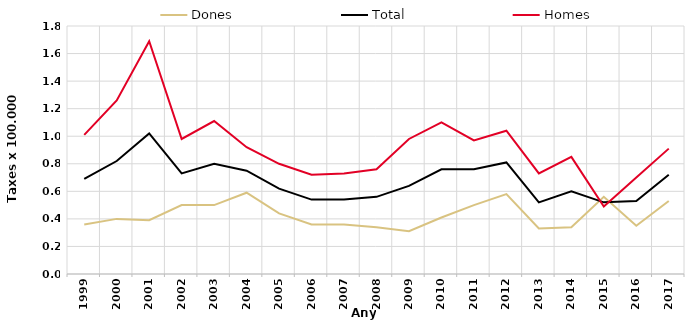
| Category | Dones | Total | Homes |
|---|---|---|---|
| 1999.0 | 0.36 | 0.69 | 1.01 |
| 2000.0 | 0.4 | 0.82 | 1.26 |
| 2001.0 | 0.39 | 1.02 | 1.69 |
| 2002.0 | 0.5 | 0.73 | 0.98 |
| 2003.0 | 0.5 | 0.8 | 1.11 |
| 2004.0 | 0.59 | 0.75 | 0.92 |
| 2005.0 | 0.44 | 0.62 | 0.8 |
| 2006.0 | 0.36 | 0.54 | 0.72 |
| 2007.0 | 0.36 | 0.54 | 0.73 |
| 2008.0 | 0.34 | 0.56 | 0.76 |
| 2009.0 | 0.31 | 0.64 | 0.98 |
| 2010.0 | 0.41 | 0.76 | 1.1 |
| 2011.0 | 0.5 | 0.76 | 0.97 |
| 2012.0 | 0.58 | 0.81 | 1.04 |
| 2013.0 | 0.33 | 0.52 | 0.73 |
| 2014.0 | 0.34 | 0.6 | 0.85 |
| 2015.0 | 0.56 | 0.52 | 0.49 |
| 2016.0 | 0.35 | 0.53 | 0.7 |
| 2017.0 | 0.53 | 0.72 | 0.91 |